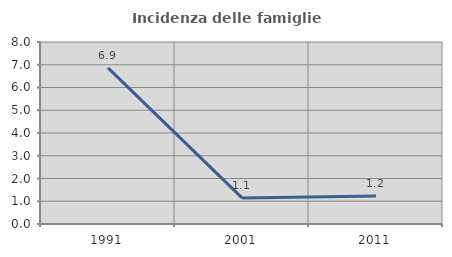
| Category | Incidenza delle famiglie numerose |
|---|---|
| 1991.0 | 6.865 |
| 2001.0 | 1.145 |
| 2011.0 | 1.227 |